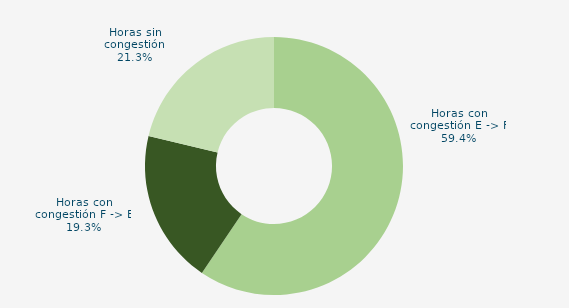
| Category | Horas con congestión E -> F |
|---|---|
| Horas con congestión E -> F | 59.444 |
| Horas con congestión F -> E | 19.306 |
| Horas sin congestión | 21.25 |